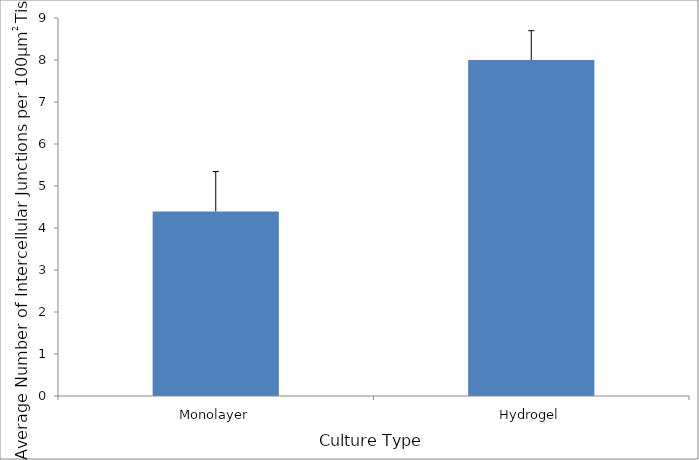
| Category | Average |
|---|---|
| Monolayer | 4.395 |
| Hydrogel | 7.998 |